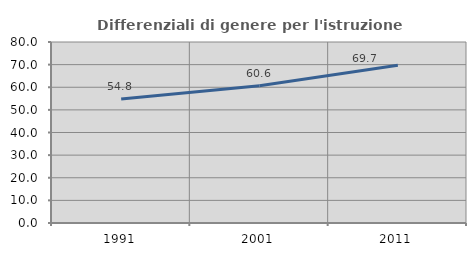
| Category | Differenziali di genere per l'istruzione superiore |
|---|---|
| 1991.0 | 54.828 |
| 2001.0 | 60.618 |
| 2011.0 | 69.72 |